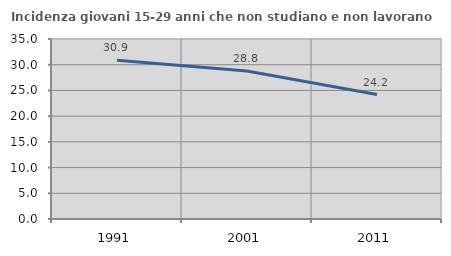
| Category | Incidenza giovani 15-29 anni che non studiano e non lavorano  |
|---|---|
| 1991.0 | 30.864 |
| 2001.0 | 28.796 |
| 2011.0 | 24.194 |